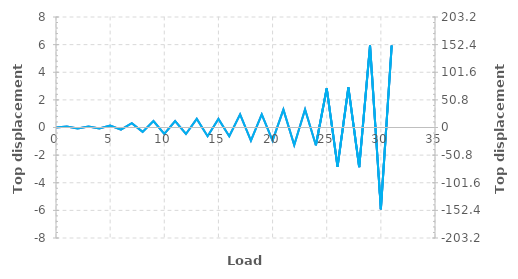
| Category | Series 0 |
|---|---|
| 0.0 | 0 |
| 1.0 | 0.078 |
| 2.0 | -0.063 |
| 3.0 | 0.073 |
| 4.0 | -0.063 |
| 5.0 | 0.146 |
| 6.0 | -0.151 |
| 7.0 | 0.313 |
| 8.0 | -0.318 |
| 9.0 | 0.464 |
| 10.0 | -0.469 |
| 11.0 | 0.464 |
| 12.0 | -0.469 |
| 13.0 | 0.625 |
| 14.0 | -0.63 |
| 15.0 | 0.62 |
| 16.0 | -0.63 |
| 17.0 | 0.948 |
| 18.0 | -0.948 |
| 19.0 | 0.953 |
| 20.0 | -0.948 |
| 21.0 | 1.297 |
| 22.0 | -1.276 |
| 23.0 | 1.302 |
| 24.0 | -1.281 |
| 25.0 | 2.828 |
| 26.0 | -2.839 |
| 27.0 | 2.896 |
| 28.0 | -2.875 |
| 29.0 | 5.928 |
| 30.0 | -5.917 |
| 31.0 | 5.938 |